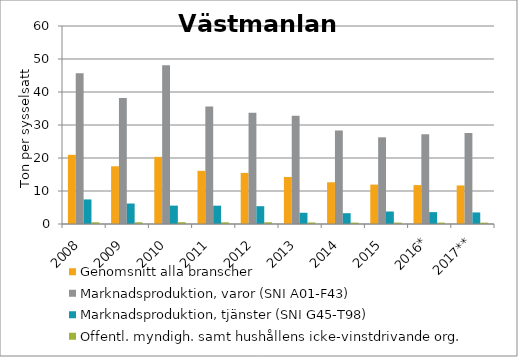
| Category | Genomsnitt alla branscher | Marknadsproduktion, varor (SNI A01-F43) | Marknadsproduktion, tjänster (SNI G45-T98) | Offentl. myndigh. samt hushållens icke-vinstdrivande org. |
|---|---|---|---|---|
| 2008 | 20.963 | 45.704 | 7.445 | 0.519 |
| 2009 | 17.488 | 38.198 | 6.205 | 0.521 |
| 2010 | 20.336 | 48.073 | 5.572 | 0.546 |
| 2011 | 16.106 | 35.582 | 5.555 | 0.519 |
| 2012 | 15.486 | 33.693 | 5.397 | 0.528 |
| 2013 | 14.249 | 32.803 | 3.405 | 0.47 |
| 2014 | 12.641 | 28.321 | 3.277 | 0.428 |
| 2015 | 11.939 | 26.27 | 3.785 | 0.426 |
| 2016* | 11.785 | 27.187 | 3.599 | 0.422 |
| 2017** | 11.687 | 27.571 | 3.503 | 0.406 |